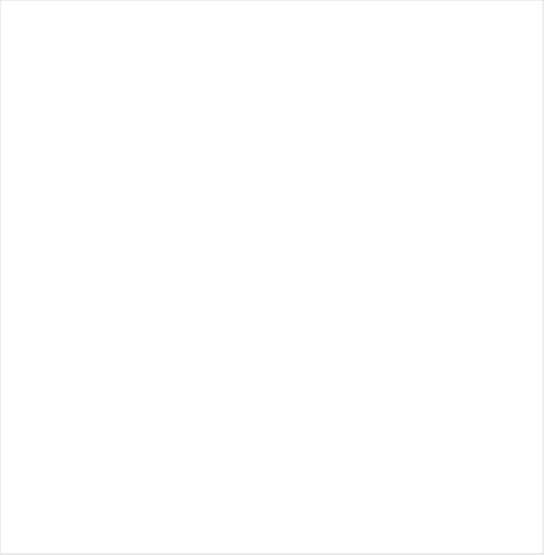
| Category | Series 0 |
|---|---|
| 0 | 5743428.51 |
| 1 | 3999297.16 |
| 2 | 2711353.69 |
| 3 | 2158668.27 |
| 4 | 1191715.41 |
| 5 | 1071909.71 |
| 6 | 939792.4 |
| 7 | 637146.03 |
| 8 | 1339782.16 |